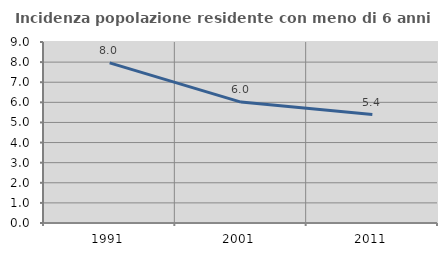
| Category | Incidenza popolazione residente con meno di 6 anni |
|---|---|
| 1991.0 | 7.964 |
| 2001.0 | 6.012 |
| 2011.0 | 5.394 |